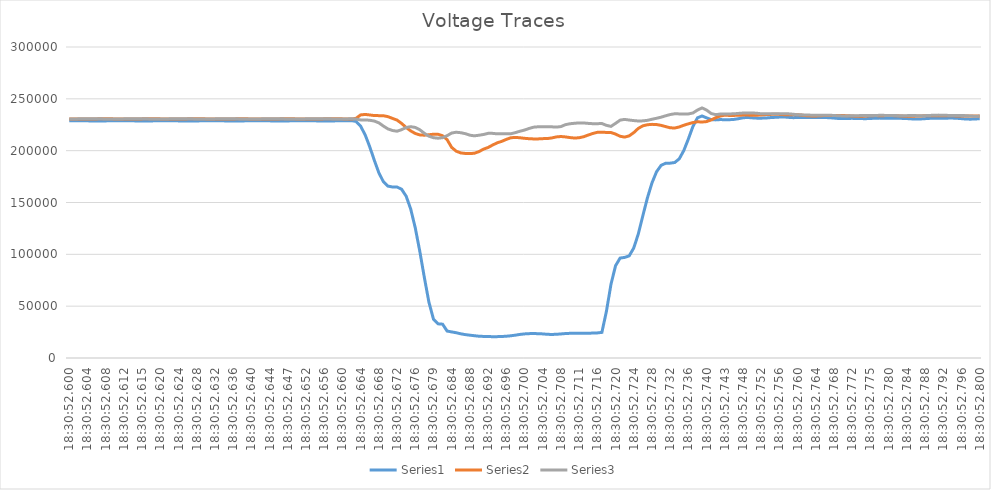
| Category | Series 0 | Series 1 | Series 2 |
|---|---|---|---|
| 0.7714421296296297 | 228878.641 | 230644.031 | 230519.016 |
| 0.7714421412037037 | 228920.5 | 230555.828 | 230585.734 |
| 0.7714421527777778 | 228905.797 | 230483.391 | 230680.75 |
| 0.7714421643518518 | 228841.328 | 230452.891 | 230764.484 |
| 0.7714421759259259 | 228753.813 | 230480.719 | 230825 |
| 0.7714421874999999 | 228674.047 | 230564.422 | 230830.938 |
| 0.7714421990740741 | 228631.609 | 230651.234 | 230783.563 |
| 0.7714422106481482 | 228653.688 | 230723.078 | 230698.688 |
| 0.7714422222222223 | 228717.219 | 230748.422 | 230604.516 |
| 0.7714422337962964 | 228813.469 | 230712.375 | 230552.578 |
| 0.7714422453703703 | 228900.172 | 230635.547 | 230541.406 |
| 0.7714422569444445 | 228940.344 | 230541.875 | 230585.938 |
| 0.7714422685185185 | 228925.703 | 230475.953 | 230674 |
| 0.7714422800925926 | 228858.344 | 230458.734 | 230761.078 |
| 0.7714422916666667 | 228765.266 | 230500.516 | 230819.984 |
| 0.7714423032407408 | 228679.094 | 230578.219 | 230825.969 |
| 0.7714423148148147 | 228636.047 | 230665 | 230776.422 |
| 0.7714423263888889 | 228651 | 230747.063 | 230698.781 |
| 0.7714423379629629 | 228704.094 | 230770.234 | 230611.859 |
| 0.771442349537037 | 228783.922 | 230739.422 | 230546.438 |
| 0.7714423611111111 | 228865 | 230661.313 | 230549.625 |
| 0.7714423726851852 | 228904.281 | 230563.984 | 230584.219 |
| 0.7714423842592592 | 228887.313 | 230481.141 | 230679.813 |
| 0.7714423958333333 | 228819.688 | 230464.734 | 230766.344 |
| 0.7714424074074074 | 228724.172 | 230500.344 | 230828.031 |
| 0.7714424189814815 | 228642.328 | 230575.391 | 230833.375 |
| 0.7714424305555556 | 228598.578 | 230674.297 | 230783.719 |
| 0.7714424421296296 | 228617.844 | 230747.75 | 230689.641 |
| 0.7714424537037038 | 228682.922 | 230769.891 | 230596.703 |
| 0.7714424652777777 | 228776.625 | 230736.703 | 230529.156 |
| 0.7714424768518519 | 228865.328 | 230655.391 | 230519.578 |
| 0.7714424884259259 | 228909.781 | 230556.141 | 230570.375 |
| 0.7714425 | 228896.234 | 230468.375 | 230664.953 |
| 0.7714425115740741 | 228832.859 | 230429.297 | 230760.328 |
| 0.7714425231481482 | 228738.375 | 230440.141 | 230820.297 |
| 0.7714425347222221 | 228653.234 | 230531.484 | 230828.219 |
| 0.7714425462962963 | 228608.203 | 230629.359 | 230775.984 |
| 0.7714425578703703 | 228628.172 | 230699.891 | 230682.844 |
| 0.7714425694444444 | 228684.719 | 230725.594 | 230582.609 |
| 0.7714425810185185 | 228791.375 | 230690.766 | 230515.875 |
| 0.7714425925925926 | 228878.797 | 230610.125 | 230503.906 |
| 0.7714426041666668 | 228924 | 230516.375 | 230550.125 |
| 0.7714426157407407 | 228911.734 | 230448.781 | 230651 |
| 0.7714426273148148 | 228845.75 | 230423.797 | 230746.844 |
| 0.7714426388888889 | 228748 | 230453.281 | 230810.266 |
| 0.771442650462963 | 228661.734 | 230543.328 | 230818.25 |
| 0.771442662037037 | 228618.063 | 230646.984 | 230767.891 |
| 0.7714426736111112 | 228628.781 | 230719.969 | 230684.219 |
| 0.7714426851851851 | 228698.734 | 230746.953 | 230590 |
| 0.7714426967592592 | 228803.547 | 230713.922 | 230540.609 |
| 0.7714427083333333 | 228884.766 | 230628.766 | 230539 |
| 0.7714427199074074 | 228927.313 | 230532.578 | 230586.063 |
| 0.7714427314814815 | 228915.656 | 230472.172 | 230683.875 |
| 0.7714427430555556 | 228849.063 | 230452.656 | 230779.266 |
| 0.7714427546296295 | 228755.969 | 230512.406 | 230845.672 |
| 0.7714427662037037 | 228674.297 | 230584.531 | 230854.406 |
| 0.7714427777777778 | 228628.656 | 230684.344 | 230803.375 |
| 0.7714427893518518 | 228634.359 | 230755.313 | 230718.859 |
| 0.771442800925926 | 228701.109 | 230781.313 | 230631.188 |
| 0.7714428125 | 228799.188 | 230749.109 | 230581.859 |
| 0.7714428240740742 | 228889.375 | 230670.844 | 230587.453 |
| 0.7714428356481481 | 228934.938 | 230562.047 | 230629.891 |
| 0.7714428472222222 | 228931.5 | 230453 | 230744.844 |
| 0.7714428587962963 | 228213.766 | 231174.703 | 230440.125 |
| 0.7714428703703704 | 223617.125 | 234490.484 | 229659.766 |
| 0.7714428819444444 | 215224.594 | 234950.594 | 229682.609 |
| 0.7714428935185186 | 203770.469 | 234442.719 | 229343.375 |
| 0.7714429050925925 | 190826.5 | 233873.422 | 228567.25 |
| 0.7714429166666666 | 178739.859 | 233788.781 | 226845.188 |
| 0.7714429282407407 | 170043.578 | 233727.328 | 223740.766 |
| 0.7714429398148148 | 165804.344 | 232812.875 | 220995.422 |
| 0.7714429513888889 | 164947.531 | 231128.203 | 219440.922 |
| 0.771442962962963 | 164921.25 | 229488.703 | 218795.078 |
| 0.7714429745370371 | 162774.625 | 226271.031 | 220249.625 |
| 0.7714429861111111 | 156150.828 | 222377.781 | 222347.344 |
| 0.7714429976851852 | 143726.469 | 219062.016 | 223146.578 |
| 0.7714430092592592 | 125632.633 | 216587.172 | 222385.906 |
| 0.7714430208333334 | 102895.508 | 215188.953 | 220175.688 |
| 0.7714430324074074 | 77636.656 | 214928.938 | 216748.094 |
| 0.7714430439814816 | 53906.711 | 215303.094 | 213948.359 |
| 0.7714430555555555 | 37517.941 | 215896.891 | 212516.813 |
| 0.7714430671296296 | 32952.797 | 215832.578 | 212020.375 |
| 0.7714430787037037 | 32640.025 | 214374.594 | 212519.828 |
| 0.7714430902777778 | 25987.793 | 210610.766 | 214467.391 |
| 0.7714431018518518 | 25162.938 | 203161.156 | 217013.859 |
| 0.771443113425926 | 24377.92 | 199485.578 | 217771.234 |
| 0.7714431249999999 | 23324.705 | 197827.016 | 217329.172 |
| 0.771443136574074 | 22568.256 | 197298.25 | 216399.406 |
| 0.7714431481481482 | 22001.203 | 197177.734 | 214933.328 |
| 0.7714431597222222 | 21495.486 | 197521.438 | 214306.469 |
| 0.7714431712962964 | 21007.092 | 199111.891 | 214904.094 |
| 0.7714431828703704 | 20811.117 | 201472.891 | 215606.484 |
| 0.7714431944444445 | 20666.932 | 203063.313 | 216706.234 |
| 0.7714432060185185 | 20590.287 | 205444.422 | 216677.672 |
| 0.7714432175925926 | 20609.6 | 207540.703 | 216250.125 |
| 0.7714432291666666 | 20730.635 | 208991.766 | 216304.281 |
| 0.7714432407407408 | 21012.035 | 210874.625 | 216274.516 |
| 0.7714432523148148 | 21433.561 | 212451.672 | 216303.578 |
| 0.771443263888889 | 22045.869 | 212798.406 | 217419.938 |
| 0.7714432754629629 | 22740.133 | 212443.672 | 218742.984 |
| 0.771443287037037 | 23237.682 | 211917.813 | 219867.938 |
| 0.771443298611111 | 23503.893 | 211540.359 | 221413.609 |
| 0.7714433101851852 | 23569.627 | 211324.969 | 222663.406 |
| 0.7714433217592592 | 23474.457 | 211343.484 | 223049.719 |
| 0.7714433333333334 | 23248.592 | 211607.391 | 222999.141 |
| 0.7714433449074075 | 22848.139 | 211665.453 | 222997.453 |
| 0.7714433564814814 | 22718.559 | 212281.75 | 222996.359 |
| 0.7714433680555556 | 22873.369 | 213266.375 | 222729.781 |
| 0.7714433796296296 | 23204.873 | 213652.953 | 223231.75 |
| 0.7714433912037038 | 23597.15 | 213264.422 | 225096.891 |
| 0.7714434027777778 | 23794.533 | 212620.078 | 225970.531 |
| 0.7714434143518519 | 23817.021 | 212186.281 | 226413.109 |
| 0.7714434259259259 | 23804.611 | 212458.797 | 226787.281 |
| 0.7714434375 | 23800.225 | 213445.656 | 226713.297 |
| 0.771443449074074 | 23887.879 | 215087.172 | 226320.031 |
| 0.7714434606481482 | 24046.566 | 216576.375 | 226006.641 |
| 0.7714434722222222 | 24197.045 | 217696.531 | 226050.203 |
| 0.7714434837962963 | 24726.973 | 217866.047 | 226164.891 |
| 0.7714434953703703 | 45122.461 | 217568.219 | 224427.172 |
| 0.7714435069444444 | 71167.273 | 217520 | 223408.766 |
| 0.7714435185185184 | 88974.406 | 216007.75 | 226320.203 |
| 0.7714435300925926 | 96389.375 | 213884.141 | 229444.594 |
| 0.7714435416666667 | 97038.93 | 213089.031 | 230167.188 |
| 0.7714435532407408 | 98533.852 | 214283.516 | 229534.406 |
| 0.7714435648148149 | 106109.703 | 217413.578 | 229022.047 |
| 0.7714435763888888 | 119665.109 | 221482.016 | 228619.891 |
| 0.771443587962963 | 137318.125 | 223976.688 | 228756.828 |
| 0.771443599537037 | 154422.813 | 225014.484 | 229244.031 |
| 0.7714436111111111 | 168873.281 | 225379.5 | 230293.547 |
| 0.7714436226851852 | 179600.906 | 225204 | 231232.25 |
| 0.7714436342592593 | 185771.313 | 224405.063 | 232287.313 |
| 0.7714436458333332 | 187877.266 | 223226.797 | 233634.078 |
| 0.7714436574074074 | 187959.703 | 222070.813 | 234850.406 |
| 0.7714436689814814 | 188582.297 | 221846.625 | 235601.391 |
| 0.7714436805555556 | 192150.797 | 222870.906 | 235465.531 |
| 0.7714436921296296 | 200183.984 | 224526.547 | 235274.547 |
| 0.7714437037037037 | 211303.453 | 225897.5 | 235438.703 |
| 0.7714437152777779 | 223375.875 | 227098.938 | 236365.422 |
| 0.7714437268518518 | 231680.438 | 227877.594 | 239176.359 |
| 0.771443738425926 | 233468.219 | 227628.469 | 241242 |
| 0.77144375 | 231625.609 | 228060.813 | 239160.5 |
| 0.7714437615740741 | 229965.859 | 229624.344 | 235855.641 |
| 0.7714437731481482 | 229685.375 | 231757.594 | 234731.703 |
| 0.7714437847222223 | 230000.563 | 233426.938 | 235322.672 |
| 0.7714437962962962 | 229857.453 | 234229.25 | 235480.453 |
| 0.7714438078703704 | 229877.672 | 233979.5 | 235444.141 |
| 0.7714438194444444 | 230138.219 | 234004.797 | 235542.859 |
| 0.7714438310185185 | 230846.547 | 234232.891 | 235941.797 |
| 0.7714438425925926 | 231731.422 | 234301.047 | 236292.391 |
| 0.7714438541666667 | 232049.109 | 234303.609 | 236367.141 |
| 0.7714438657407406 | 231665.438 | 234224.469 | 236371.781 |
| 0.7714438773148148 | 231382.125 | 234172.188 | 236099.609 |
| 0.7714438888888888 | 231353.672 | 234454.391 | 235594.547 |
| 0.771443900462963 | 231495.016 | 234796.25 | 235506.328 |
| 0.7714439120370371 | 231880.844 | 234960.406 | 235612.828 |
| 0.7714439236111111 | 232142.078 | 235166.516 | 235547.953 |
| 0.7714439351851853 | 232373.844 | 235001.984 | 235614.156 |
| 0.7714439467592592 | 232520.922 | 234701.016 | 235640.219 |
| 0.7714439583333333 | 232122.844 | 234685.438 | 235520.203 |
| 0.7714439699074074 | 231848.781 | 234681.406 | 235158.016 |
| 0.7714439814814815 | 231933.828 | 234648.391 | 234626.797 |
| 0.7714439930555556 | 232007.484 | 234255.531 | 234528.25 |
| 0.7714440046296297 | 232019.313 | 233679.063 | 234456.5 |
| 0.7714440162037036 | 231895.281 | 233535.203 | 234227.813 |
| 0.7714440277777778 | 231944.766 | 233513.156 | 234248.891 |
| 0.7714440393518518 | 232113.109 | 233673.344 | 234281.078 |
| 0.7714440509259259 | 231964.641 | 233965.469 | 234272.469 |
| 0.7714440625 | 231778.563 | 233981.844 | 234206.531 |
| 0.7714440740740741 | 231429.969 | 233948.359 | 233915.234 |
| 0.7714440856481483 | 231047.563 | 233943.266 | 233620.375 |
| 0.7714440972222222 | 231005.734 | 233876.672 | 233494.141 |
| 0.7714441087962963 | 231128.859 | 233711.047 | 233536.656 |
| 0.7714441203703704 | 231154.531 | 233435.844 | 233735.484 |
| 0.7714441319444445 | 231095.328 | 233156.563 | 233741.984 |
| 0.7714441435185185 | 230927.641 | 233151 | 233851.156 |
| 0.7714441550925927 | 230868.828 | 233395.344 | 233930.422 |
| 0.7714441666666666 | 231058.422 | 233682.5 | 233881.484 |
| 0.7714441782407407 | 231301.938 | 233814.047 | 233934.453 |
| 0.7714441898148148 | 231393.172 | 233779.422 | 234083.797 |
| 0.7714442013888889 | 231357.203 | 233791.922 | 234041.703 |
| 0.771444212962963 | 231260.078 | 233842.891 | 234002.656 |
| 0.7714442245370371 | 231206.75 | 233799.969 | 233880.141 |
| 0.771444236111111 | 231214.375 | 233645.141 | 233781.563 |
| 0.7714442476851852 | 231140.453 | 233369.156 | 233722.781 |
| 0.7714442592592592 | 230961.813 | 233117.594 | 233798.109 |
| 0.7714442708333333 | 230669.609 | 233190.234 | 233859.094 |
| 0.7714442824074075 | 230484.891 | 233338.422 | 233805.953 |
| 0.7714442939814815 | 230593.703 | 233523.359 | 233694.016 |
| 0.7714443055555557 | 230880.344 | 233611.109 | 233767.344 |
| 0.7714443171296296 | 231163.688 | 233604.891 | 233966.813 |
| 0.7714443287037037 | 231365.813 | 233622.297 | 234207.688 |
| 0.7714443402777778 | 231337.875 | 233671.313 | 234287.156 |
| 0.7714443518518519 | 231320.344 | 233710.797 | 234199.328 |
| 0.7714443634259259 | 231385.938 | 233802.031 | 234025.281 |
| 0.7714443750000001 | 231421.563 | 233662.281 | 233975.797 |
| 0.771444386574074 | 231244.688 | 233459.094 | 233991.406 |
| 0.7714443981481481 | 230882.688 | 233334.359 | 233964.313 |
| 0.7714444097222222 | 230482.609 | 233403.375 | 233737.828 |
| 0.7714444212962963 | 230393.797 | 233480.656 | 233432.641 |
| 0.7714444328703703 | 230536.313 | 233460.578 | 233232.844 |
| 0.7714444444444445 | 230854.875 | 233335.5 | 233375.797 |